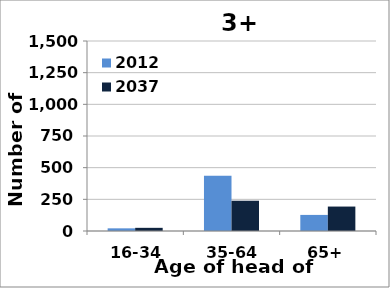
| Category | 2012 | 2037 |
|---|---|---|
| 16-34 | 21 | 25 |
| 35-64 | 437 | 239 |
| 65+ | 127 | 193 |